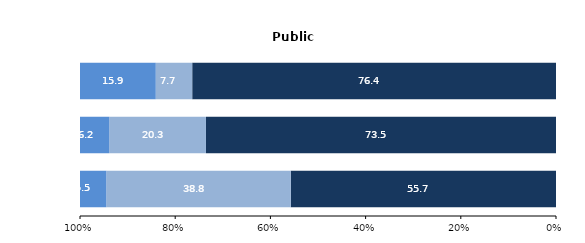
| Category | État (1) | Collectivités territoriales | Autres (2) |
|---|---|---|---|
| Établissements du premier degré
(écoles maternelles et élémentaires) | 55.722 | 38.753 | 5.524 |
| Établissements du second degré (3)
(collèges et lycées) | 73.538 | 20.311 | 6.152 |
| Établissements du supérieur | 76.427 | 7.658 | 15.915 |